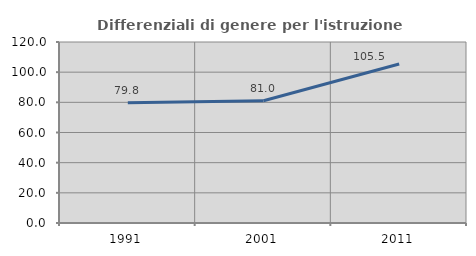
| Category | Differenziali di genere per l'istruzione superiore |
|---|---|
| 1991.0 | 79.777 |
| 2001.0 | 81.015 |
| 2011.0 | 105.453 |